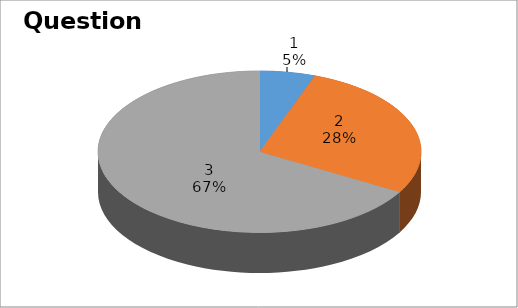
| Category | Series 0 |
|---|---|
| 0 | 1 |
| 1 | 5 |
| 2 | 12 |